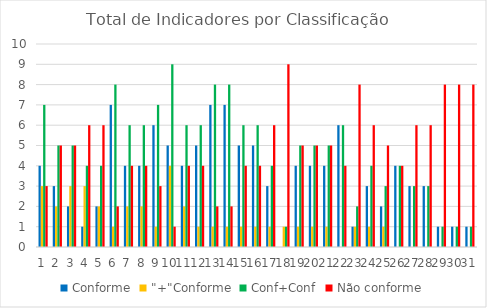
| Category | Conforme | "+"Conforme | Conf+Conf | Não conforme |
|---|---|---|---|---|
| 0 | 4 | 3 | 7 | 3 |
| 1 | 3 | 2 | 5 | 5 |
| 2 | 2 | 3 | 5 | 5 |
| 3 | 1 | 3 | 4 | 6 |
| 4 | 2 | 2 | 4 | 6 |
| 5 | 7 | 1 | 8 | 2 |
| 6 | 4 | 2 | 6 | 4 |
| 7 | 4 | 2 | 6 | 4 |
| 8 | 6 | 1 | 7 | 3 |
| 9 | 5 | 4 | 9 | 1 |
| 10 | 4 | 2 | 6 | 4 |
| 11 | 5 | 1 | 6 | 4 |
| 12 | 7 | 1 | 8 | 2 |
| 13 | 7 | 1 | 8 | 2 |
| 14 | 5 | 1 | 6 | 4 |
| 15 | 5 | 1 | 6 | 4 |
| 16 | 3 | 1 | 4 | 6 |
| 17 | 0 | 1 | 1 | 9 |
| 18 | 4 | 1 | 5 | 5 |
| 19 | 4 | 1 | 5 | 5 |
| 20 | 4 | 1 | 5 | 5 |
| 21 | 6 | 0 | 6 | 4 |
| 22 | 1 | 1 | 2 | 8 |
| 23 | 3 | 1 | 4 | 6 |
| 24 | 2 | 1 | 3 | 5 |
| 25 | 4 | 0 | 4 | 4 |
| 26 | 3 | 0 | 3 | 6 |
| 27 | 3 | 0 | 3 | 6 |
| 28 | 1 | 0 | 1 | 8 |
| 29 | 1 | 0 | 1 | 8 |
| 30 | 1 | 0 | 1 | 8 |